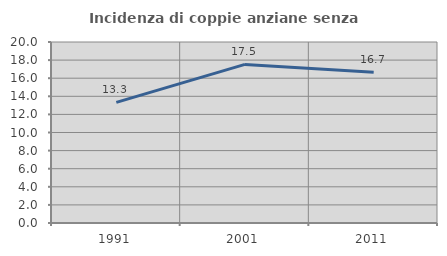
| Category | Incidenza di coppie anziane senza figli  |
|---|---|
| 1991.0 | 13.333 |
| 2001.0 | 17.526 |
| 2011.0 | 16.667 |